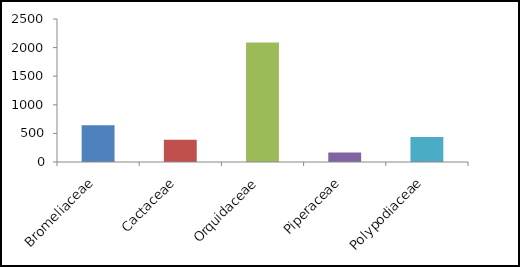
| Category | Quantidade |
|---|---|
| Bromeliaceae | 644 |
| Cactaceae | 390 |
| Orquidaceae | 2091 |
| Piperaceae | 166 |
| Polypodiaceae | 435 |